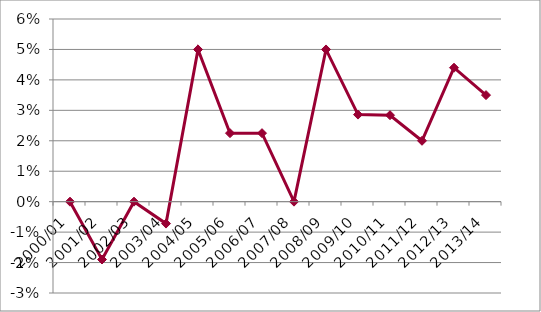
| Category | Series 0 |
|---|---|
| 2000/01 | 0 |
| 2001/02 | -0.019 |
| 2002/03 | 0 |
| 2003/04 | -0.007 |
| 2004/05 | 0.05 |
| 2005/06 | 0.022 |
| 2006/07 | 0.022 |
| 2007/08 | 0 |
| 2008/09 | 0.05 |
| 2009/10 | 0.029 |
| 2010/11 | 0.028 |
| 2011/12 | 0.02 |
| 2012/13 | 0.044 |
| 2013/14 | 0.035 |